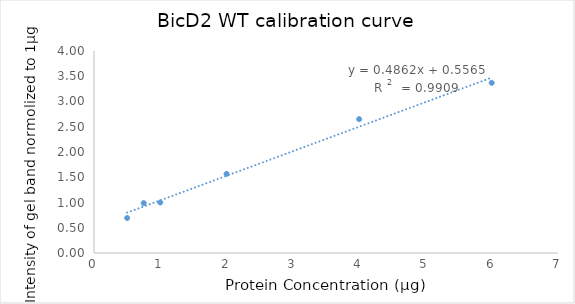
| Category | Series 0 |
|---|---|
| 0.5 | 0.693 |
| 0.75 | 0.988 |
| 1.0 | 1 |
| 2.0 | 1.566 |
| 4.0 | 2.65 |
| 6.0 | 3.369 |